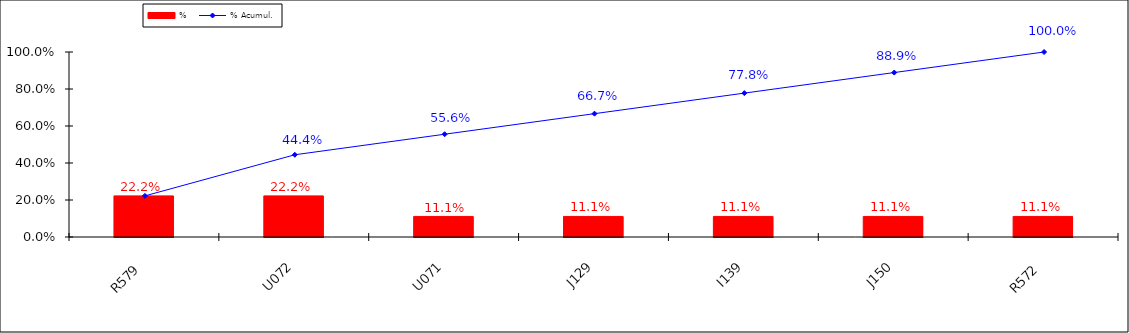
| Category | % |
|---|---|
| R579 | 0.222 |
| U072 | 0.222 |
| U071 | 0.111 |
| J129 | 0.111 |
| I139 | 0.111 |
| J150 | 0.111 |
| R572 | 0.111 |